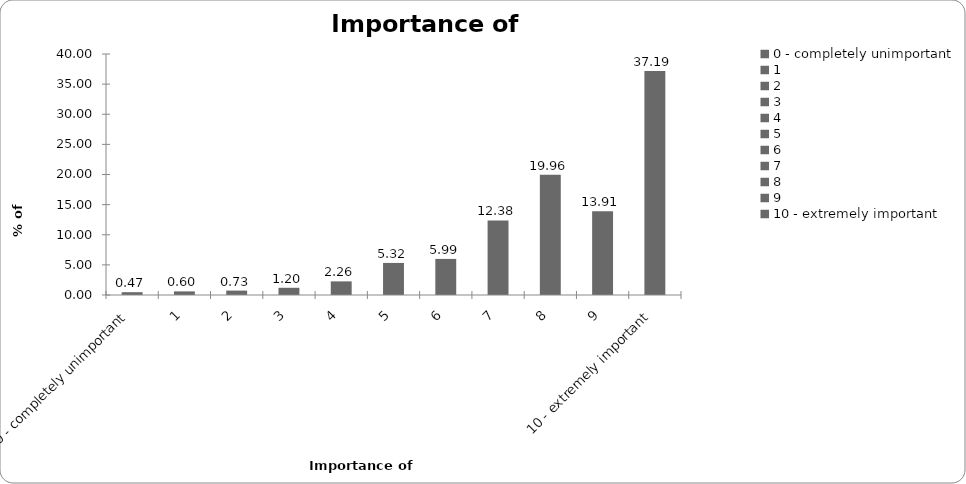
| Category | Importance of insurance |
|---|---|
| 0 - completely unimportant | 0.466 |
| 1 | 0.599 |
| 2 | 0.732 |
| 3 | 1.198 |
| 4 | 2.262 |
| 5 | 5.323 |
| 6 | 5.988 |
| 7 | 12.375 |
| 8 | 19.96 |
| 9 | 13.906 |
| 10 - extremely important | 37.192 |